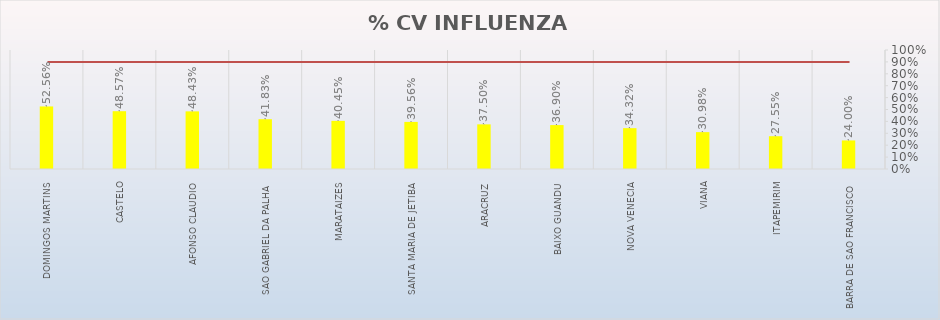
| Category | % CV INFLUENZA |
|---|---|
| DOMINGOS MARTINS | 0.526 |
| CASTELO | 0.486 |
| AFONSO CLAUDIO | 0.484 |
| SAO GABRIEL DA PALHA | 0.418 |
| MARATAIZES | 0.405 |
| SANTA MARIA DE JETIBA | 0.396 |
| ARACRUZ | 0.375 |
| BAIXO GUANDU | 0.369 |
| NOVA VENECIA | 0.343 |
| VIANA | 0.31 |
| ITAPEMIRIM | 0.276 |
| BARRA DE SAO FRANCISCO | 0.24 |